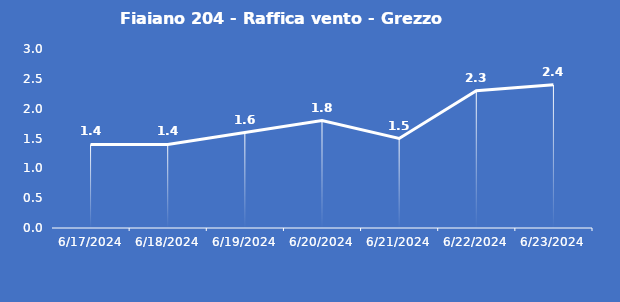
| Category | Fiaiano 204 - Raffica vento - Grezzo (m/s) |
|---|---|
| 6/17/24 | 1.4 |
| 6/18/24 | 1.4 |
| 6/19/24 | 1.6 |
| 6/20/24 | 1.8 |
| 6/21/24 | 1.5 |
| 6/22/24 | 2.3 |
| 6/23/24 | 2.4 |